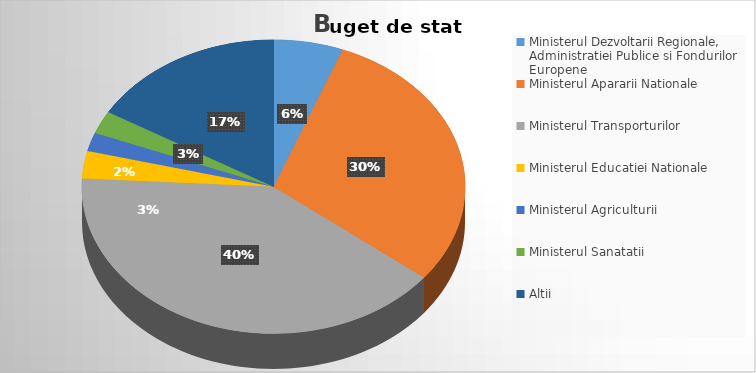
| Category | Series 0 |
|---|---|
| Ministerul Dezvoltarii Regionale, Administratiei Publice si Fondurilor Europene | 5.874 |
| Ministerul Apararii Nationale | 29.77 |
| Ministerul Transporturilor | 40.249 |
| Ministerul Educatiei Nationale | 3.025 |
| Ministerul Agriculturii | 2.049 |
| Ministerul Sanatatii | 2.506 |
| Altii | 16.525 |